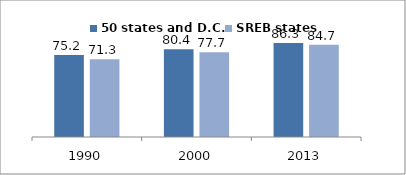
| Category | 50 states and D.C. | SREB states |
|---|---|---|
| 1990.0 | 75.235 | 71.253 |
| 2000.0 | 80.399 | 77.731 |
| 2013.0 | 86.287 | 84.703 |